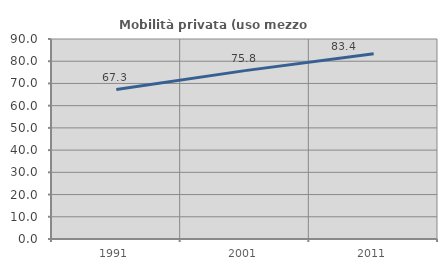
| Category | Mobilità privata (uso mezzo privato) |
|---|---|
| 1991.0 | 67.259 |
| 2001.0 | 75.768 |
| 2011.0 | 83.376 |